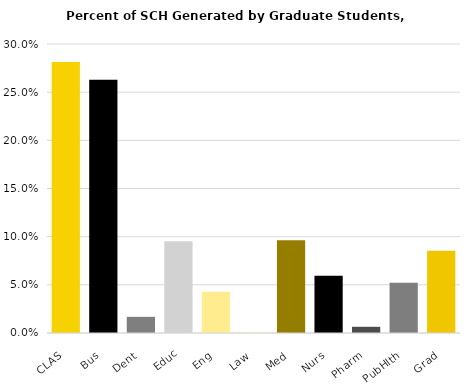
| Category | Series 0 |
|---|---|
| CLAS | 0.281 |
| Bus | 0.263 |
| Dent | 0.017 |
| Educ | 0.095 |
| Eng | 0.043 |
| Law | 0.001 |
| Med | 0.096 |
| Nurs | 0.059 |
| Pharm | 0.006 |
| PubHlth | 0.052 |
| Grad | 0.085 |